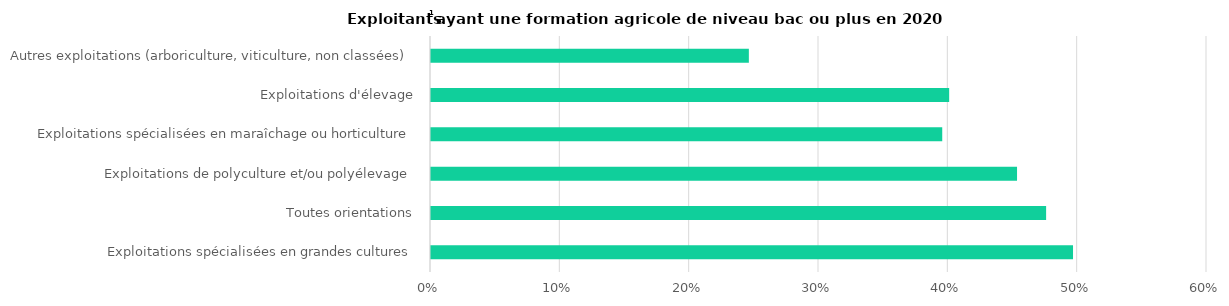
| Category | Series 0 |
|---|---|
| Exploitations spécialisées en grandes cultures | 0.496 |
| Toutes orientations | 0.476 |
| Exploitations de polyculture et/ou polyélevage | 0.453 |
| Exploitations spécialisées en maraîchage ou horticulture | 0.395 |
| Exploitations d'élevage | 0.401 |
| Autres exploitations (arboriculture, viticulture, non classées) | 0.246 |